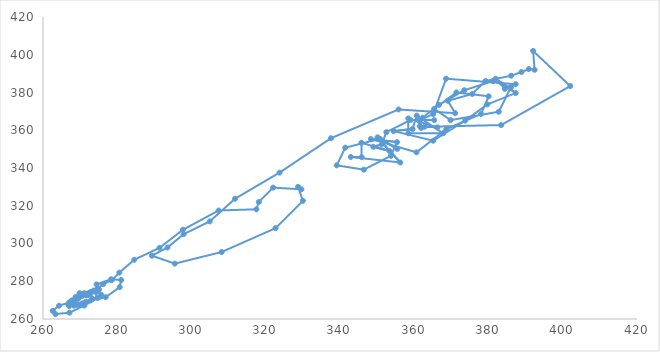
| Category | Series 0 |
|---|---|
| 273.1772428242825 | 274.428 |
| 274.42824282428245 | 274.428 |
| 274.42824282428245 | 278.348 |
| 278.34824282428247 | 281.066 |
| 281.0662428242825 | 280.657 |
| 280.65724282428243 | 276.881 |
| 276.8812428242825 | 271.542 |
| 271.5422428242825 | 269.161 |
| 269.16124282428245 | 267.525 |
| 267.5252428242825 | 269.329 |
| 269.32924282428246 | 270.555 |
| 270.55524282428246 | 272.215 |
| 272.2152428242825 | 272.768 |
| 272.7682428242825 | 273.345 |
| 273.3452428242825 | 270.652 |
| 270.65224282428244 | 268.343 |
| 268.34324282428247 | 267.044 |
| 267.04424282428243 | 266.803 |
| 266.80324282428245 | 267.766 |
| 267.7662428242825 | 269.834 |
| 269.83424282428246 | 273.682 |
| 273.68224282428247 | 275.077 |
| 275.07724282428245 | 275.654 |
| 275.65424282428245 | 272.864 |
| 272.8642428242825 | 269.906 |
| 269.90624282428246 | 267.621 |
| 267.62124282428243 | 268.439 |
| 268.4392428242825 | 269.666 |
| 269.66624282428245 | 271.133 |
| 271.13324282428243 | 273.682 |
| 273.68224282428247 | 274.74 |
| 274.74024282428246 | 271.133 |
| 271.13324282428243 | 267.116 |
| 267.11624282428244 | 263.34 |
| 263.3402428242825 | 262.619 |
| 262.6192428242825 | 264.326 |
| 264.3262428242825 | 267.044 |
| 267.04424282428243 | 268.752 |
| 268.75224282428246 | 271.638 |
| 271.6382428242825 | 272.624 |
| 272.6242428242825 | 274.163 |
| 274.16324282428246 | 274.74 |
| 274.74024282428246 | 276.232 |
| 276.2322428242825 | 278.517 |
| 278.51724282428245 | 280.561 |
| 280.56124282428243 | 284.578 |
| 284.5782428242825 | 291.384 |
| 291.38424282428247 | 297.71 |
| 297.71024282428243 | 307.306 |
| 307.30624282428244 | 317.48 |
| 317.48024282428247 | 318.129 |
| 318.12924282428247 | 321.978 |
| 321.97824282428246 | 329.602 |
| 329.6022428242825 | 328.712 |
| 328.71224282428244 | 330.011 |
| 330.0112428242825 | 322.627 |
| 322.62724282428246 | 308.124 |
| 308.1242428242825 | 295.497 |
| 295.49724282428247 | 289.34 |
| 289.3402428242825 | 293.525 |
| 293.5252428242825 | 297.878 |
| 297.87824282428244 | 304.925 |
| 304.92524282428246 | 311.732 |
| 311.7322428242825 | 323.709 |
| 323.70924282428246 | 337.563 |
| 337.56324282428244 | 355.77 |
| 355.77024282428243 | 371.019 |
| 371.01924282428246 | 369.046 |
| 369.04624282428244 | 375.612 |
| 375.6122428242825 | 379.22 |
| 379.2202428242825 | 386.099 |
| 386.09924282428244 | 388.889 |
| 388.88924282428246 | 390.861 |
| 390.86124282428244 | 392.424 |
| 392.42424282428243 | 392.016 |
| 392.0162428242825 | 402.021 |
| 402.02124282428247 | 383.405 |
| 383.4052428242825 | 362.745 |
| 362.74524282428246 | 361.831 |
| 361.83124282428247 | 361.254 |
| 361.25424282428247 | 365.102 |
| 365.1022428242825 | 368.565 |
| 368.56524282428245 | 387.326 |
| 387.3262428242825 | 384.391 |
| 384.3912428242825 | 381.914 |
| 381.91424282428244 | 387.326 |
| 387.3262428242825 | 379.701 |
| 379.7012428242825 | 373.712 |
| 373.71224282428244 | 365.102 |
| 365.1022428242825 | 354.447 |
| 354.44724282428245 | 359.546 |
| 359.54624282428244 | 360.676 |
| 360.67624282428244 | 367.748 |
| 367.74824282428244 | 358.392 |
| 358.39224282428245 | 358.392 |
| 358.39224282428245 | 366.256 |
| 366.2562428242825 | 361.494 |
| 361.4942428242825 | 362.24 |
| 362.24024282428246 | 366.665 |
| 366.6652428242825 | 373.472 |
| 373.47224282428243 | 381.192 |
| 381.19224282428246 | 386.027 |
| 386.02724282428244 | 382.756 |
| 382.7562428242825 | 369.792 |
| 369.7922428242825 | 365.367 |
| 365.36724282428247 | 371.355 |
| 371.35524282428247 | 380.038 |
| 380.03824282428246 | 377.994 |
| 377.9942428242825 | 368.638 |
| 368.6382428242825 | 360.604 |
| 360.60424282428244 | 348.314 |
| 348.3142428242825 | 355.361 |
| 355.36124282428244 | 353.726 |
| 353.72624282428245 | 346.414 |
| 346.41424282428244 | 339.126 |
| 339.1262428242825 | 341.411 |
| 341.41124282428245 | 350.767 |
| 350.76724282428245 | 355.433 |
| 355.43324282428244 | 350.118 |
| 350.11824282428245 | 356.251 |
| 356.2512428242825 | 342.902 |
| 342.90224282428244 | 345.837 |
| 345.83724282428244 | 345.765 |
| 345.76524282428244 | 353.389 |
| 353.38924282428246 | 348.963 |
| 348.9632428242825 | 351.248 |
| 351.24824282428244 | 352.475 |
| 352.4752428242825 | 358.969 |
| 358.96924282428245 | 365.367 |
| 365.36724282428247 | 365.367 |